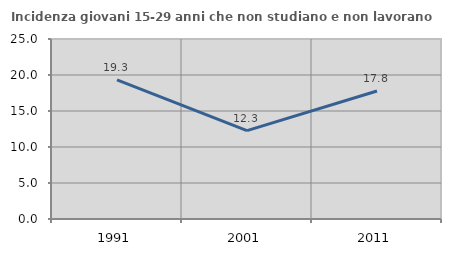
| Category | Incidenza giovani 15-29 anni che non studiano e non lavorano  |
|---|---|
| 1991.0 | 19.313 |
| 2001.0 | 12.276 |
| 2011.0 | 17.781 |